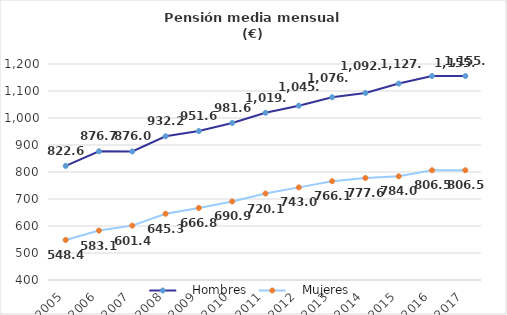
| Category |    Hombres |    Mujeres |
|---|---|---|
| 2005.0 | 822.643 | 548.357 |
| 2006.0 | 876.714 | 583.143 |
| 2007.0 | 876 | 601.429 |
| 2008.0 | 932.214 | 645.286 |
| 2009.0 | 951.643 | 666.786 |
| 2010.0 | 981.643 | 690.929 |
| 2011.0 | 1019.357 | 720.143 |
| 2012.0 | 1045.643 | 743 |
| 2013.0 | 1076.786 | 766.071 |
| 2014.0 | 1092.929 | 777.643 |
| 2015.0 | 1127.429 | 784 |
| 2016.0 | 1155.357 | 806.5 |
| 2017.0 | 1155.357 | 806.5 |